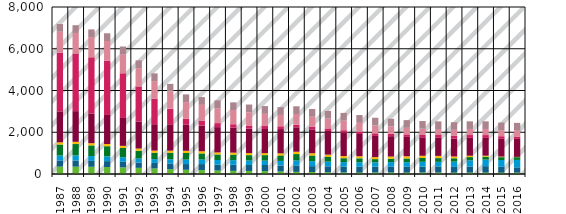
| Category | atmosphärische Deposition auf Gewässerflächen | Erosion | Grundwasser | Oberflächenabfluss | Drainagen | urbane Gebiete (Kanalisationssysteme) | industrielle Direkteinleiter | kommunale Kläranlagen | historischer Bergbau |
|---|---|---|---|---|---|---|---|---|---|
| 1987.0 | 354.273 | 293.903 | 235.979 | 528.851 | 105.769 | 1482.65 | 2814.303 | 999.287 | 370.835 |
| 1988.0 | 350.454 | 297.451 | 244.191 | 542.965 | 107.048 | 1469.214 | 2761.484 | 984.355 | 370.835 |
| 1989.0 | 345.361 | 281.662 | 233.448 | 510.129 | 105.65 | 1423.741 | 2691.069 | 964.446 | 370.835 |
| 1990.0 | 333.695 | 282.258 | 228.802 | 486.46 | 106.847 | 1391.089 | 2603.087 | 938.263 | 370.835 |
| 1991.0 | 316.728 | 267.391 | 217.821 | 445.584 | 101.517 | 1336.668 | 2139.632 | 910.785 | 370.835 |
| 1992.0 | 294.461 | 255.612 | 196.7 | 371.465 | 102.24 | 1295.34 | 1676.176 | 882.011 | 370.835 |
| 1993.0 | 266.894 | 265.218 | 180.953 | 308.591 | 98.529 | 1265.157 | 1212.72 | 851.94 | 370.835 |
| 1994.0 | 234.026 | 272.115 | 197.949 | 311.181 | 104.963 | 1256.418 | 749.264 | 820.574 | 370.835 |
| 1995.0 | 201.159 | 275.099 | 215.822 | 313.466 | 105.845 | 1246.136 | 295.876 | 789.208 | 370.835 |
| 1996.0 | 187.253 | 288.41 | 216.775 | 294.482 | 102.169 | 1234.299 | 235.346 | 754.62 | 370.835 |
| 1997.0 | 170.336 | 285.041 | 213.973 | 266.949 | 97.741 | 1211.044 | 192.411 | 716.81 | 370.835 |
| 1998.0 | 149.036 | 291.567 | 219.886 | 265.488 | 97.834 | 1193.996 | 167.073 | 675.78 | 370.835 |
| 1999.0 | 145.666 | 288.318 | 215.025 | 255.069 | 95.541 | 1174.534 | 151.038 | 631.527 | 370.835 |
| 2000.0 | 139.659 | 292.493 | 207.103 | 265.094 | 93.239 | 1157.875 | 142.531 | 584.053 | 370.835 |
| 2001.0 | 119.337 | 289.394 | 218.326 | 261.031 | 103.167 | 1160.864 | 134.238 | 543.961 | 370.835 |
| 2002.0 | 101.774 | 303.645 | 244.279 | 305.484 | 111.249 | 1169.433 | 125.944 | 511.25 | 370.835 |
| 2003.0 | 95.967 | 281.595 | 237.004 | 274.829 | 104.441 | 1144.985 | 117.763 | 485.922 | 370.835 |
| 2004.0 | 78.803 | 288.001 | 224.968 | 235.413 | 102.153 | 1135.241 | 117.875 | 467.975 | 370.835 |
| 2005.0 | 70.849 | 282.617 | 218.145 | 186.017 | 101.111 | 1121.232 | 117.987 | 457.411 | 370.835 |
| 2006.0 | 67.875 | 280.443 | 215.017 | 189.267 | 97.177 | 1066.05 | 119.741 | 418.43 | 369.649 |
| 2007.0 | 70.895 | 281.69 | 206.861 | 153.374 | 96.139 | 1014.771 | 121.494 | 381.562 | 368.463 |
| 2008.0 | 71.201 | 284.076 | 213.722 | 163.079 | 103.273 | 975.887 | 120.884 | 346.807 | 367.277 |
| 2009.0 | 70.189 | 278.249 | 217.546 | 179.025 | 104.641 | 927.066 | 122.698 | 314.908 | 366.091 |
| 2010.0 | 70.785 | 285.394 | 228.705 | 182.499 | 107.824 | 883.172 | 127.657 | 285.864 | 364.905 |
| 2011.0 | 68.629 | 284.343 | 230.515 | 178.121 | 105.298 | 867.115 | 134.622 | 287.349 | 364.905 |
| 2012.0 | 65.601 | 275.868 | 250.109 | 162.739 | 84.336 | 855.363 | 132.677 | 289.323 | 364.905 |
| 2013.0 | 65.067 | 294.952 | 291.501 | 158.928 | 65.659 | 855.155 | 134.862 | 291.297 | 364.905 |
| 2014.0 | 65.85 | 310.424 | 311.319 | 142.04 | 46.808 | 853.676 | 134.623 | 292.528 | 364.905 |
| 2015.0 | 64.447 | 277.741 | 328.183 | 136.521 | 27.419 | 849.804 | 126.785 | 290.017 | 364.905 |
| 2016.0 | 63.322 | 256.672 | 354.124 | 132.502 | 13.876 | 859.831 | 113.418 | 291.212 | 364.905 |